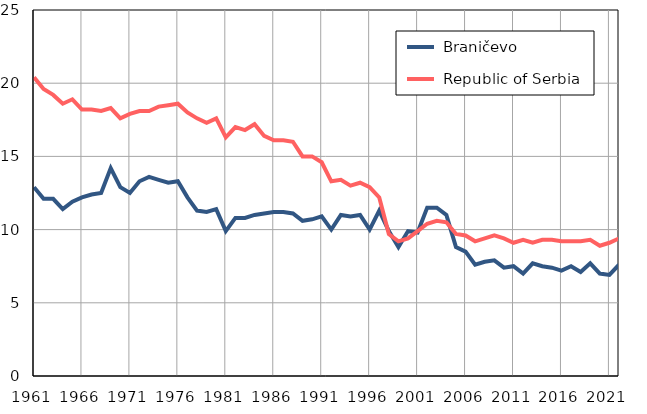
| Category |  Braničevo |  Republic of Serbia |
|---|---|---|
| 1961.0 | 12.9 | 20.4 |
| 1962.0 | 12.1 | 19.6 |
| 1963.0 | 12.1 | 19.2 |
| 1964.0 | 11.4 | 18.6 |
| 1965.0 | 11.9 | 18.9 |
| 1966.0 | 12.2 | 18.2 |
| 1967.0 | 12.4 | 18.2 |
| 1968.0 | 12.5 | 18.1 |
| 1969.0 | 14.2 | 18.3 |
| 1970.0 | 12.9 | 17.6 |
| 1971.0 | 12.5 | 17.9 |
| 1972.0 | 13.3 | 18.1 |
| 1973.0 | 13.6 | 18.1 |
| 1974.0 | 13.4 | 18.4 |
| 1975.0 | 13.2 | 18.5 |
| 1976.0 | 13.3 | 18.6 |
| 1977.0 | 12.2 | 18 |
| 1978.0 | 11.3 | 17.6 |
| 1979.0 | 11.2 | 17.3 |
| 1980.0 | 11.4 | 17.6 |
| 1981.0 | 9.9 | 16.3 |
| 1982.0 | 10.8 | 17 |
| 1983.0 | 10.8 | 16.8 |
| 1984.0 | 11 | 17.2 |
| 1985.0 | 11.1 | 16.4 |
| 1986.0 | 11.2 | 16.1 |
| 1987.0 | 11.2 | 16.1 |
| 1988.0 | 11.1 | 16 |
| 1989.0 | 10.6 | 15 |
| 1990.0 | 10.7 | 15 |
| 1991.0 | 10.9 | 14.6 |
| 1992.0 | 10 | 13.3 |
| 1993.0 | 11 | 13.4 |
| 1994.0 | 10.9 | 13 |
| 1995.0 | 11 | 13.2 |
| 1996.0 | 10 | 12.9 |
| 1997.0 | 11.3 | 12.2 |
| 1998.0 | 9.9 | 9.7 |
| 1999.0 | 8.8 | 9.2 |
| 2000.0 | 9.9 | 9.4 |
| 2001.0 | 9.8 | 9.9 |
| 2002.0 | 11.5 | 10.4 |
| 2003.0 | 11.5 | 10.6 |
| 2004.0 | 11 | 10.5 |
| 2005.0 | 8.8 | 9.7 |
| 2006.0 | 8.5 | 9.6 |
| 2007.0 | 7.6 | 9.2 |
| 2008.0 | 7.8 | 9.4 |
| 2009.0 | 7.9 | 9.6 |
| 2010.0 | 7.4 | 9.4 |
| 2011.0 | 7.5 | 9.1 |
| 2012.0 | 7 | 9.3 |
| 2013.0 | 7.7 | 9.1 |
| 2014.0 | 7.5 | 9.3 |
| 2015.0 | 7.4 | 9.3 |
| 2016.0 | 7.2 | 9.2 |
| 2017.0 | 7.5 | 9.2 |
| 2018.0 | 7.1 | 9.2 |
| 2019.0 | 7.7 | 9.3 |
| 2020.0 | 7 | 8.9 |
| 2021.0 | 6.9 | 9.1 |
| 2022.0 | 7.6 | 9.4 |